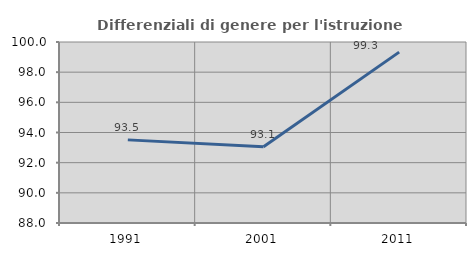
| Category | Differenziali di genere per l'istruzione superiore |
|---|---|
| 1991.0 | 93.511 |
| 2001.0 | 93.06 |
| 2011.0 | 99.33 |